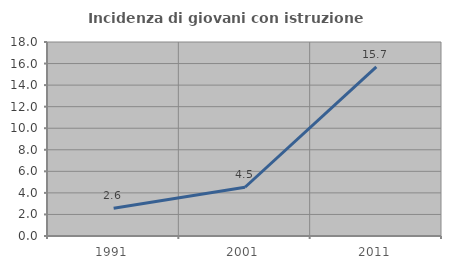
| Category | Incidenza di giovani con istruzione universitaria |
|---|---|
| 1991.0 | 2.577 |
| 2001.0 | 4.523 |
| 2011.0 | 15.698 |